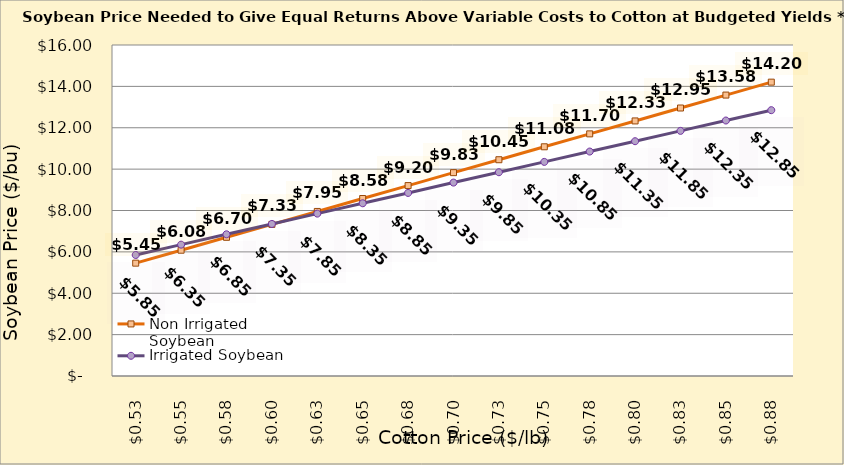
| Category | Non Irrigated Soybean | Irrigated Soybean |
|---|---|---|
| 0.5249999999999998 | 5.455 | 5.849 |
| 0.5499999999999998 | 6.08 | 6.349 |
| 0.5749999999999998 | 6.705 | 6.849 |
| 0.5999999999999999 | 7.33 | 7.349 |
| 0.6249999999999999 | 7.955 | 7.849 |
| 0.6499999999999999 | 8.58 | 8.349 |
| 0.6749999999999999 | 9.205 | 8.849 |
| 0.7 | 9.83 | 9.349 |
| 0.725 | 10.455 | 9.849 |
| 0.75 | 11.08 | 10.349 |
| 0.775 | 11.705 | 10.849 |
| 0.8 | 12.33 | 11.349 |
| 0.8250000000000001 | 12.955 | 11.849 |
| 0.8500000000000001 | 13.58 | 12.349 |
| 0.8750000000000001 | 14.205 | 12.849 |